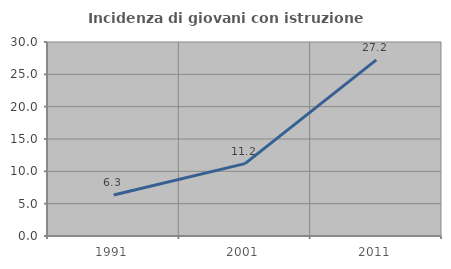
| Category | Incidenza di giovani con istruzione universitaria |
|---|---|
| 1991.0 | 6.329 |
| 2001.0 | 11.194 |
| 2011.0 | 27.241 |